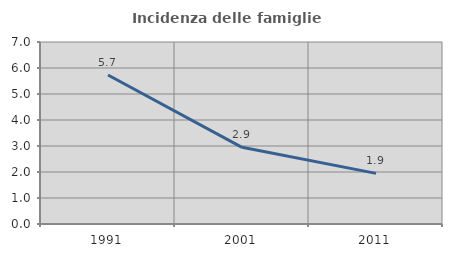
| Category | Incidenza delle famiglie numerose |
|---|---|
| 1991.0 | 5.73 |
| 2001.0 | 2.949 |
| 2011.0 | 1.947 |